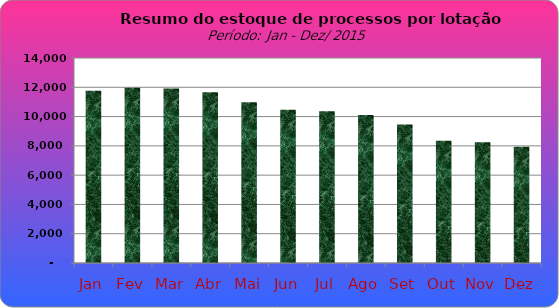
| Category | Series 0 |
|---|---|
| Jan | 11768 |
| Fev | 11973 |
| Mar | 11918 |
| Abr | 11669 |
| Mai | 10977 |
| Jun | 10462 |
| Jul | 10364 |
| Ago | 10110 |
| Set | 9465 |
| Out | 8346 |
| Nov | 8241 |
| Dez | 7941 |